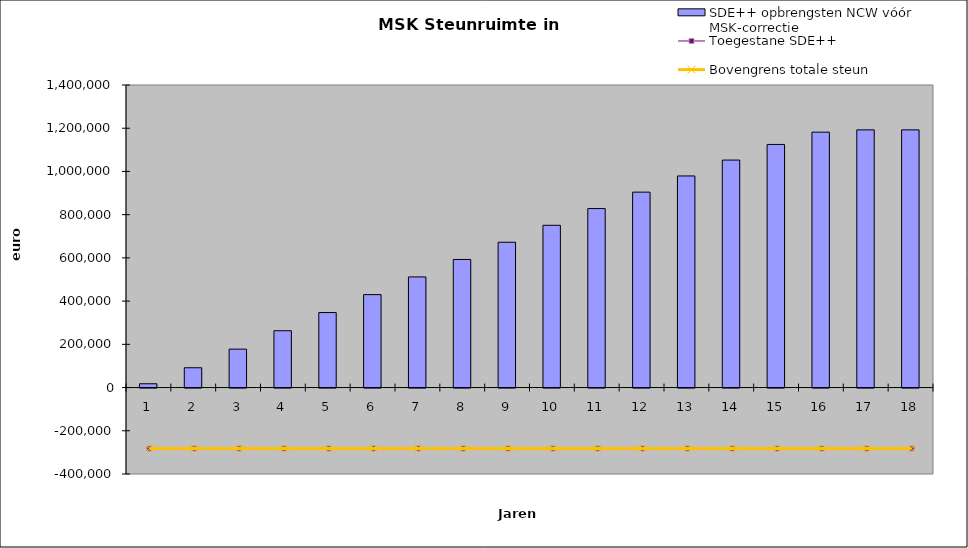
| Category | SDE++ opbrengsten NCW vóór MSK-correctie |
|---|---|
| 0 | 17600 |
| 1 | 91600 |
| 2 | 177784 |
| 3 | 262931.68 |
| 4 | 347022.314 |
| 5 | 430034.76 |
| 6 | 511947.455 |
| 7 | 592738.404 |
| 8 | 672385.172 |
| 9 | 750864.876 |
| 10 | 828154.173 |
| 11 | 904229.257 |
| 12 | 979065.842 |
| 13 | 1052639.159 |
| 14 | 1124923.942 |
| 15 | 1181753.104 |
| 16 | 1192359.092 |
| 17 | 1192359.092 |